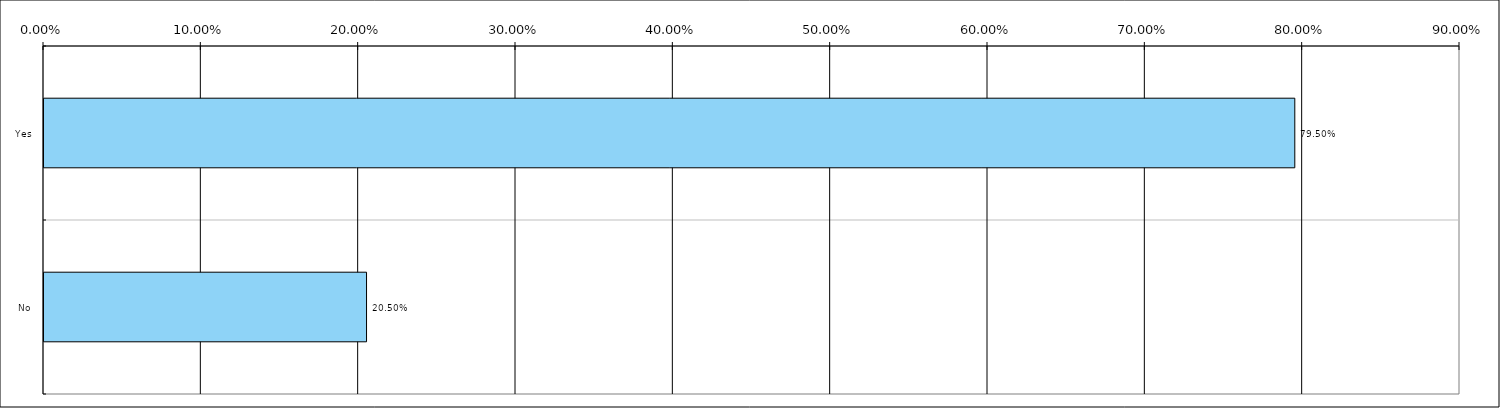
| Category | Total(United Kingdom) |
|---|---|
| Yes | 0.795 |
| No | 0.205 |